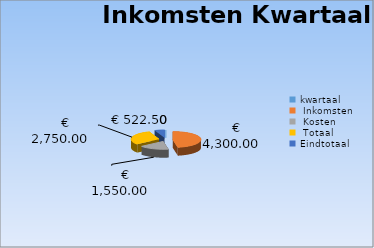
| Category | Series 0 |
|---|---|
| kwartaal | 0 |
| Inkomsten | 4300 |
| Kosten | 1550 |
| Totaal | 2750 |
| Eindtotaal | 522.5 |